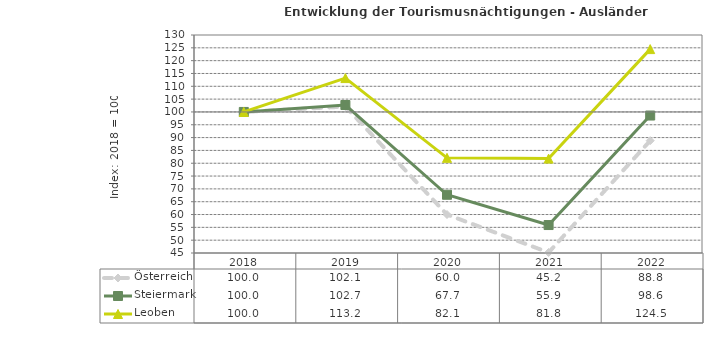
| Category | Österreich | Steiermark | Leoben |
|---|---|---|---|
| 2022.0 | 88.8 | 98.6 | 124.5 |
| 2021.0 | 45.2 | 55.9 | 81.8 |
| 2020.0 | 60 | 67.7 | 82.1 |
| 2019.0 | 102.1 | 102.7 | 113.2 |
| 2018.0 | 100 | 100 | 100 |